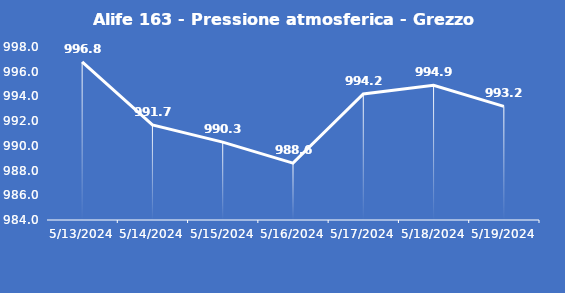
| Category | Alife 163 - Pressione atmosferica - Grezzo (hPa) |
|---|---|
| 5/13/24 | 996.8 |
| 5/14/24 | 991.7 |
| 5/15/24 | 990.3 |
| 5/16/24 | 988.6 |
| 5/17/24 | 994.2 |
| 5/18/24 | 994.9 |
| 5/19/24 | 993.2 |